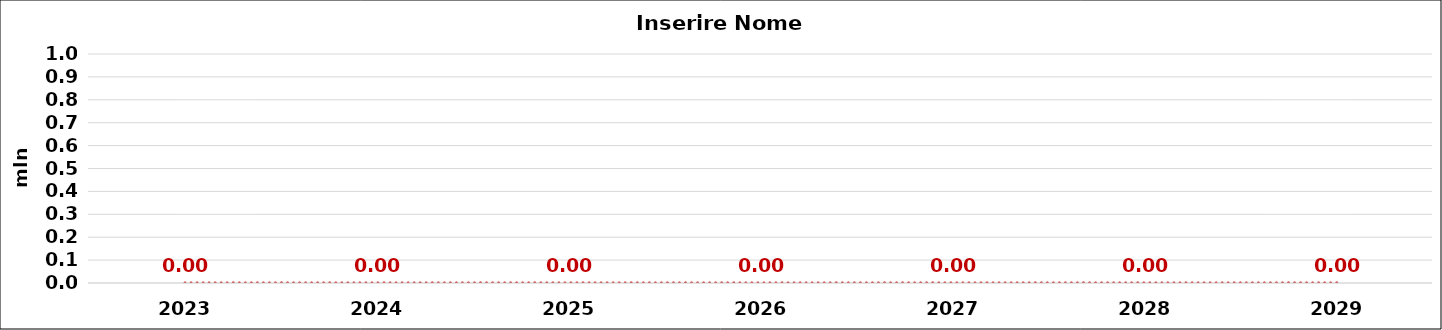
| Category | Series 0 |
|---|---|
| 2023.0 | 0 |
| 2024.0 | 0 |
| 2025.0 | 0 |
| 2026.0 | 0 |
| 2027.0 | 0 |
| 2028.0 | 0 |
| 2029.0 | 0 |